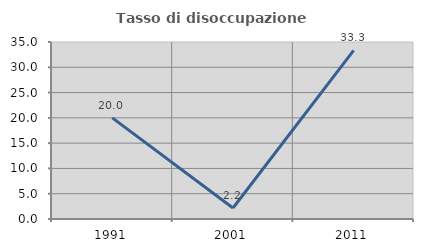
| Category | Tasso di disoccupazione giovanile  |
|---|---|
| 1991.0 | 20 |
| 2001.0 | 2.174 |
| 2011.0 | 33.333 |